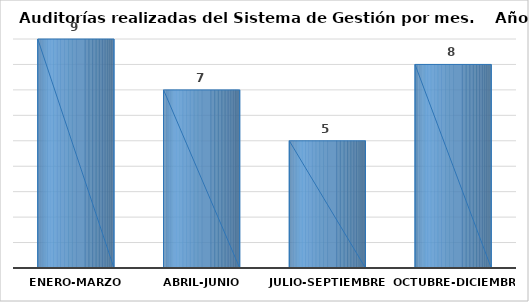
| Category | Series 0 |
|---|---|
| Enero-Marzo | 9 |
| Abril-Junio | 7 |
| Julio-Septiembre | 5 |
| Octubre-Diciembre | 8 |